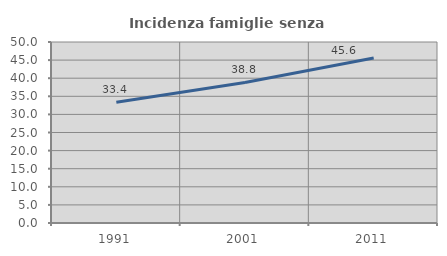
| Category | Incidenza famiglie senza nuclei |
|---|---|
| 1991.0 | 33.362 |
| 2001.0 | 38.832 |
| 2011.0 | 45.597 |